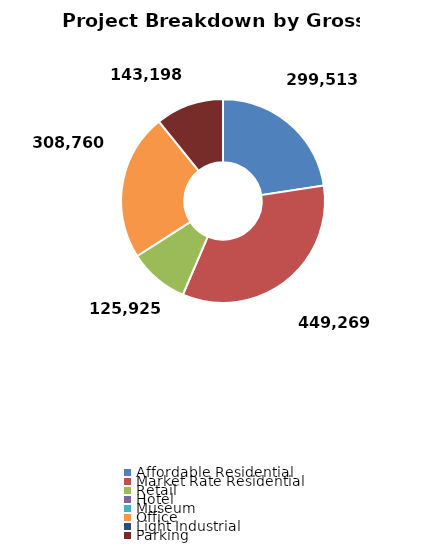
| Category | Series 0 |
|---|---|
| Affordable Residential | 299512.8 |
| Market Rate Residential | 449269.2 |
| Retail | 125925 |
| Hotel | 0 |
| Museum | 0 |
| Office | 308760 |
| Light Industrial | 0 |
| Parking | 143198 |